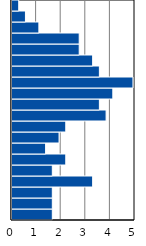
| Category | Series 0 |
|---|---|
| 0-4 | 1.639 |
| 5-9 | 1.639 |
| 10-14 | 1.639 |
| 15-19 | 3.279 |
| 20-24 | 1.639 |
| 25-29 | 2.186 |
| 30-34 | 1.366 |
| 35-39 | 1.913 |
| 40-44 | 2.186 |
| 45-49 | 3.825 |
| 50-54 | 3.552 |
| 55-59 | 4.098 |
| 60-64 | 4.918 |
| 65-69 | 3.552 |
| 70-74 | 3.279 |
| 75-79 | 2.732 |
| 80-84 | 2.732 |
| 85-89 | 1.093 |
| 90-94 | 0.546 |
| 95+ | 0.273 |